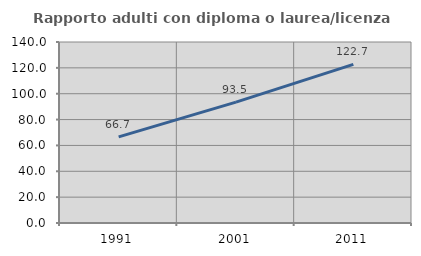
| Category | Rapporto adulti con diploma o laurea/licenza media  |
|---|---|
| 1991.0 | 66.651 |
| 2001.0 | 93.465 |
| 2011.0 | 122.706 |